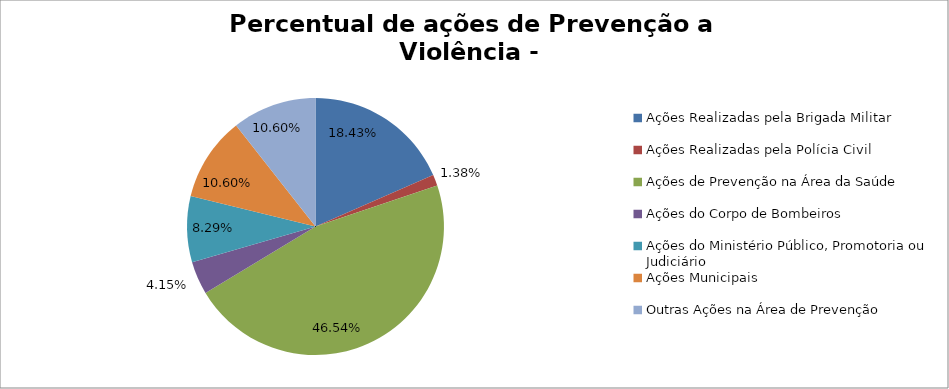
| Category | Percentual |
|---|---|
| Ações Realizadas pela Brigada Militar | 0.184 |
| Ações Realizadas pela Polícia Civil | 0.014 |
| Ações de Prevenção na Área da Saúde | 0.465 |
| Ações do Corpo de Bombeiros | 0.041 |
| Ações do Ministério Público, Promotoria ou Judiciário | 0.083 |
| Ações Municipais | 0.106 |
| Outras Ações na Área de Prevenção | 0.106 |